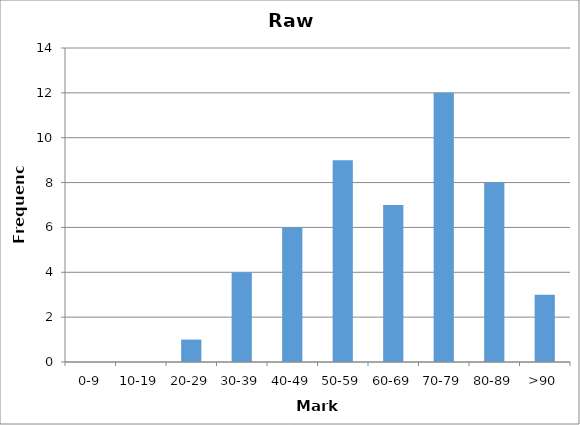
| Category | Series 0 |
|---|---|
| 0-9 | 0 |
| 10-19 | 0 |
| 20-29 | 1 |
| 30-39 | 4 |
| 40-49 | 6 |
| 50-59 | 9 |
| 60-69 | 7 |
| 70-79 | 12 |
| 80-89 | 8 |
| >90 | 3 |